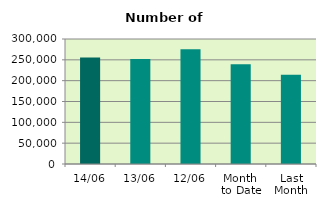
| Category | Series 0 |
|---|---|
| 14/06 | 255608 |
| 13/06 | 251960 |
| 12/06 | 275612 |
| Month 
to Date | 239156.8 |
| Last
Month | 214383.182 |